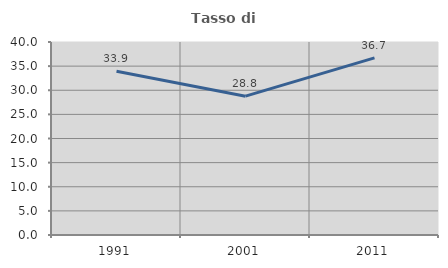
| Category | Tasso di occupazione   |
|---|---|
| 1991.0 | 33.933 |
| 2001.0 | 28.771 |
| 2011.0 | 36.709 |